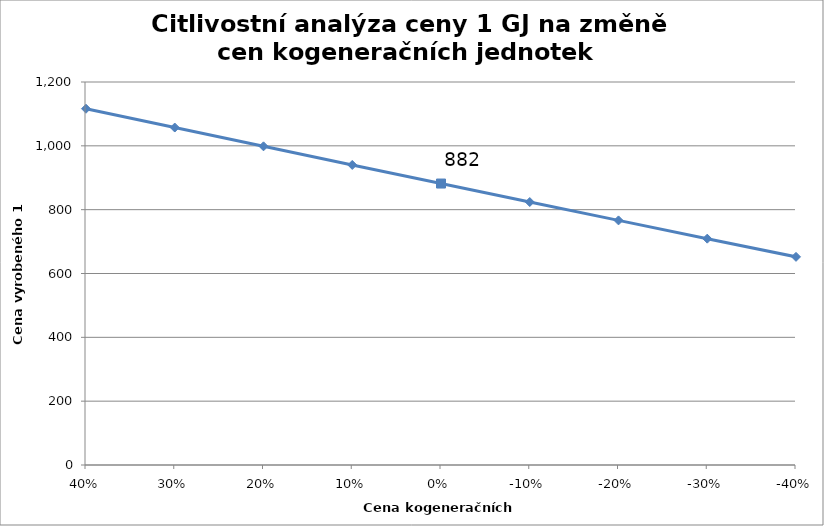
| Category | Cena 1 GJ |
|---|---|
| 0.4 | 1116.234 |
| 0.3 | 1057.331 |
| 0.2 | 998.486 |
| 0.1 | 940.081 |
| 0.0 | 881.858 |
| -0.1 | 823.937 |
| -0.2 | 766.399 |
| -0.3 | 709.127 |
| -0.4 | 652.176 |